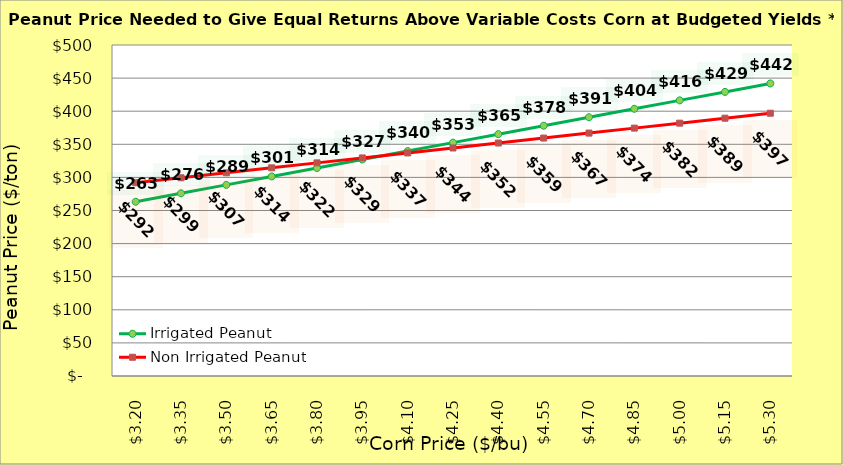
| Category | Irrigated Peanut | Non Irrigated Peanut |
|---|---|---|
| 3.2 | 263.185 | 291.939 |
| 3.35 | 275.951 | 299.439 |
| 3.5 | 288.717 | 306.939 |
| 3.65 | 301.483 | 314.439 |
| 3.8 | 314.249 | 321.939 |
| 3.9499999999999997 | 327.015 | 329.439 |
| 4.1 | 339.781 | 336.939 |
| 4.25 | 352.547 | 344.439 |
| 4.4 | 365.313 | 351.939 |
| 4.550000000000001 | 378.079 | 359.439 |
| 4.700000000000001 | 390.845 | 366.939 |
| 4.850000000000001 | 403.611 | 374.439 |
| 5.000000000000002 | 416.377 | 381.939 |
| 5.150000000000002 | 429.143 | 389.439 |
| 5.3000000000000025 | 441.909 | 396.939 |